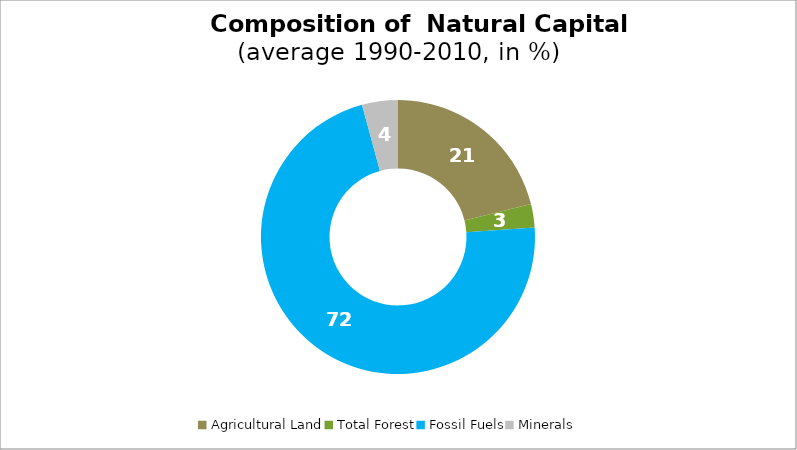
| Category | Series 0 |
|---|---|
| Agricultural Land | 21.14 |
| Total Forest | 2.747 |
| Fossil Fuels | 71.88 |
| Minerals | 4.234 |